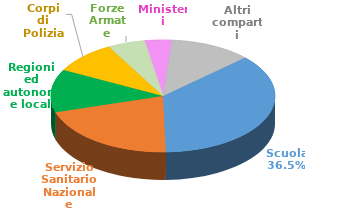
| Category | Series 0 |
|---|---|
| Scuola | 1183442 |
| Servizio Sanitario Nazionale | 670566 |
| Regioni ed autonomie locali | 400147 |
| Corpi di Polizia | 303134 |
| Forze Armate | 172383 |
| Ministeri | 126641 |
| Altri comparti | 382655 |